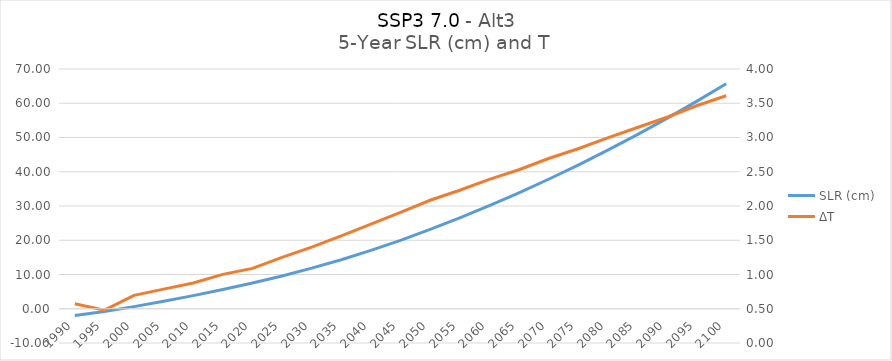
| Category | SLR (cm) |
|---|---|
| 1990.0 | -1.941 |
| 1995.0 | -0.818 |
| 2000.0 | 0.621 |
| 2005.0 | 2.18 |
| 2010.0 | 3.834 |
| 2015.0 | 5.633 |
| 2020.0 | 7.505 |
| 2025.0 | 9.582 |
| 2030.0 | 11.846 |
| 2035.0 | 14.32 |
| 2040.0 | 17.029 |
| 2045.0 | 19.965 |
| 2050.0 | 23.149 |
| 2055.0 | 26.515 |
| 2060.0 | 30.093 |
| 2065.0 | 33.841 |
| 2070.0 | 37.811 |
| 2075.0 | 41.954 |
| 2080.0 | 46.306 |
| 2085.0 | 50.853 |
| 2090.0 | 55.589 |
| 2095.0 | 60.556 |
| 2100.0 | 65.705 |